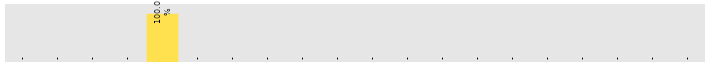
| Category | Saturday |
|---|---|
| Accounts | 0 |
| HR | 0 |
| Lobby/Reception | 0 |
| Administration | 0 |
| Customer Support | 1 |
| Finance | 0 |
| Human Resources | 0 |
| IT | 0 |
| Marketing | 0 |
| R&D | 0 |
| Sales | 0 |